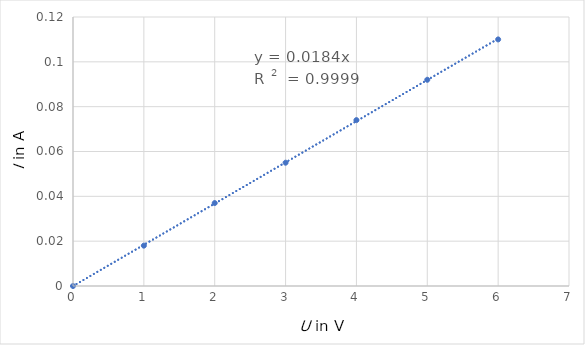
| Category | Series 0 |
|---|---|
| 0.0 | 0 |
| 1.0 | 0.018 |
| 2.0 | 0.037 |
| 3.0 | 0.055 |
| 4.0 | 0.074 |
| 5.0 | 0.092 |
| 6.0 | 0.11 |